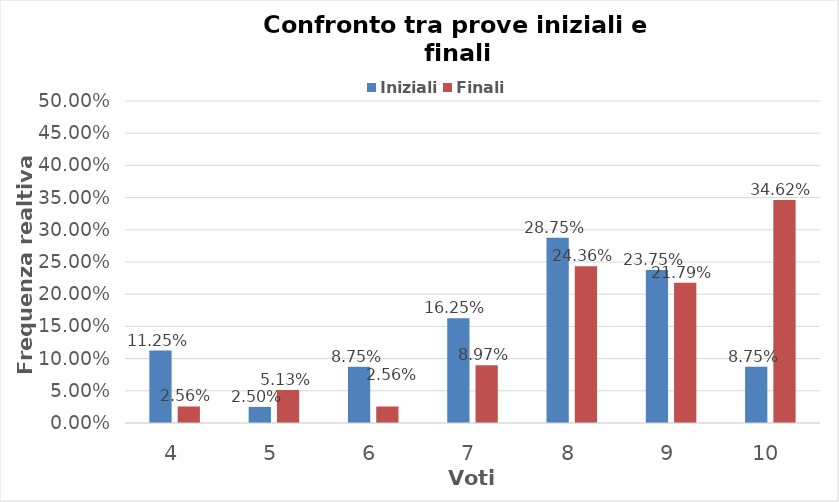
| Category | Iniziali | Finali |
|---|---|---|
| 4.0 | 0.112 | 0.026 |
| 5.0 | 0.025 | 0.051 |
| 6.0 | 0.088 | 0.026 |
| 7.0 | 0.162 | 0.09 |
| 8.0 | 0.288 | 0.244 |
| 9.0 | 0.238 | 0.218 |
| 10.0 | 0.088 | 0.346 |